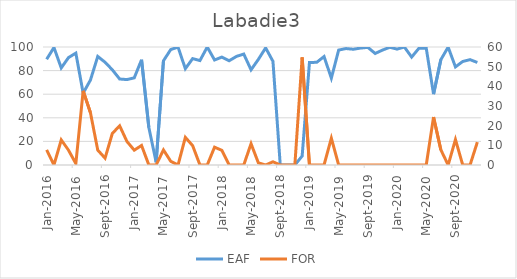
| Category | EAF |
|---|---|
| 2016-01-01 | 89.6 |
| 2016-02-01 | 99.56 |
| 2016-03-01 | 82.28 |
| 2016-04-01 | 91.07 |
| 2016-05-01 | 94.81 |
| 2016-06-01 | 60.87 |
| 2016-07-01 | 72.02 |
| 2016-08-01 | 92 |
| 2016-09-01 | 87.09 |
| 2016-10-01 | 80.66 |
| 2016-11-01 | 72.88 |
| 2016-12-01 | 72.39 |
| 2017-01-01 | 73.86 |
| 2017-02-01 | 89.17 |
| 2017-03-01 | 31.78 |
| 2017-04-01 | 2.33 |
| 2017-05-01 | 88.33 |
| 2017-06-01 | 97.84 |
| 2017-07-01 | 99.86 |
| 2017-08-01 | 81.63 |
| 2017-09-01 | 90.17 |
| 2017-10-01 | 88.5 |
| 2017-11-01 | 100 |
| 2017-12-01 | 89 |
| 2018-01-01 | 91.44 |
| 2018-02-01 | 88.36 |
| 2018-03-01 | 92.01 |
| 2018-04-01 | 94.05 |
| 2018-05-01 | 80.67 |
| 2018-06-01 | 89.48 |
| 2018-07-01 | 99.26 |
| 2018-08-01 | 87.86 |
| 2018-09-01 | 0 |
| 2018-10-01 | 0 |
| 2018-11-01 | 0 |
| 2018-12-01 | 7.6 |
| 2019-01-01 | 86.81 |
| 2019-02-01 | 87.05 |
| 2019-03-01 | 91.9 |
| 2019-04-01 | 73.62 |
| 2019-05-01 | 97.39 |
| 2019-06-01 | 98.69 |
| 2019-07-01 | 98.09 |
| 2019-08-01 | 99.09 |
| 2019-09-01 | 99.69 |
| 2019-10-01 | 94.51 |
| 2019-11-01 | 97.37 |
| 2019-12-01 | 99.76 |
| 2020-01-01 | 98.2 |
| 2020-02-01 | 100 |
| 2020-03-01 | 91.46 |
| 2020-04-01 | 98.95 |
| 2020-05-01 | 98.94 |
| 2020-06-01 | 60.08 |
| 2020-07-01 | 89.27 |
| 2020-08-01 | 99.89 |
| 2020-09-01 | 83.14 |
| 2020-10-01 | 87.73 |
| 2020-11-01 | 89.29 |
| 2020-12-01 | 86.89 |